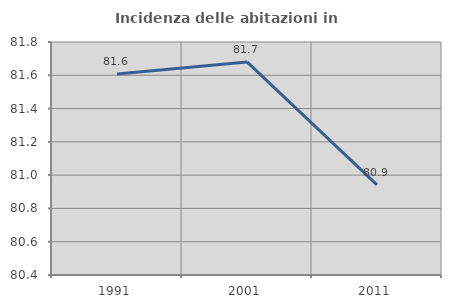
| Category | Incidenza delle abitazioni in proprietà  |
|---|---|
| 1991.0 | 81.607 |
| 2001.0 | 81.68 |
| 2011.0 | 80.941 |